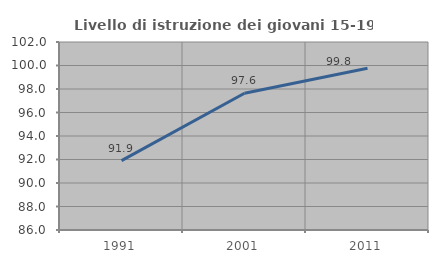
| Category | Livello di istruzione dei giovani 15-19 anni |
|---|---|
| 1991.0 | 91.908 |
| 2001.0 | 97.642 |
| 2011.0 | 99.767 |